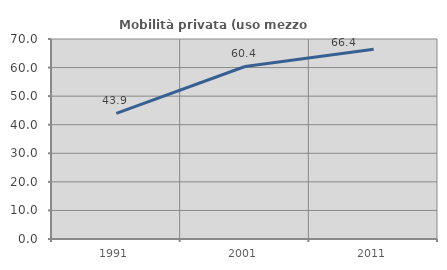
| Category | Mobilità privata (uso mezzo privato) |
|---|---|
| 1991.0 | 43.949 |
| 2001.0 | 60.385 |
| 2011.0 | 66.425 |